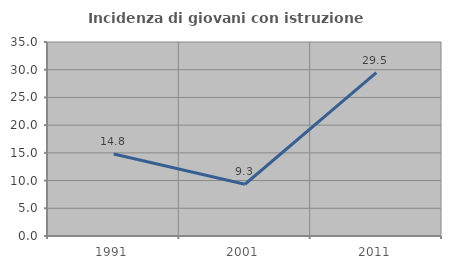
| Category | Incidenza di giovani con istruzione universitaria |
|---|---|
| 1991.0 | 14.783 |
| 2001.0 | 9.333 |
| 2011.0 | 29.457 |